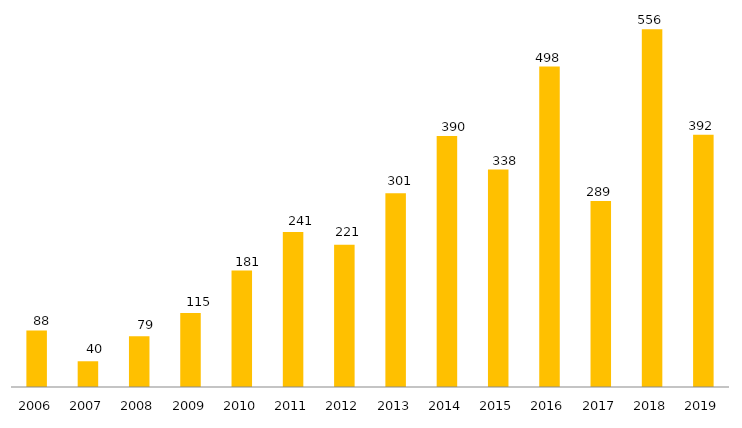
| Category | TOTAL |
|---|---|
| 2006.0 | 88 |
| 2007.0 | 40 |
| 2008.0 | 79 |
| 2009.0 | 115 |
| 2010.0 | 181 |
| 2011.0 | 241 |
| 2012.0 | 221 |
| 2013.0 | 301 |
| 2014.0 | 390 |
| 2015.0 | 338 |
| 2016.0 | 498 |
| 2017.0 | 289 |
| 2018.0 | 556 |
| 2019.0 | 392 |